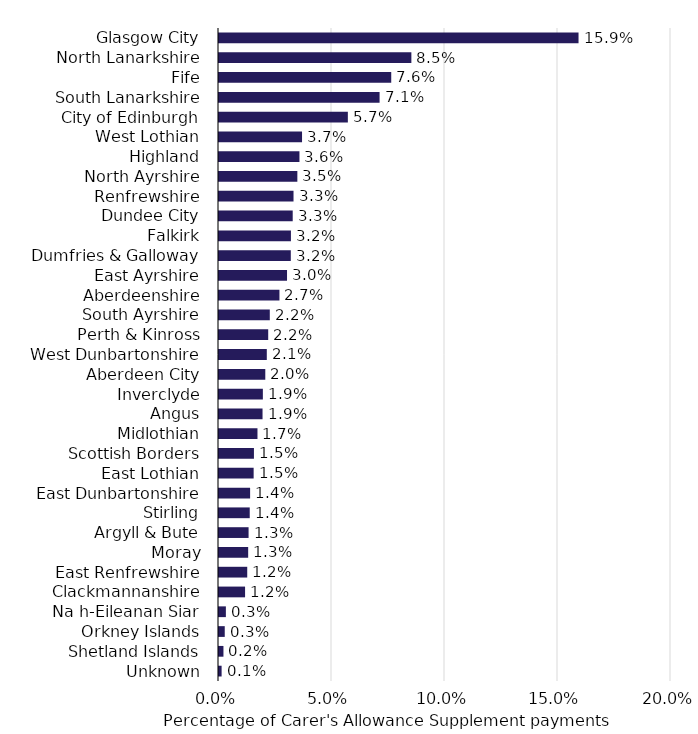
| Category | April Eligibiltiy |
|---|---|
| Glasgow City | 0.159 |
| North Lanarkshire | 0.085 |
| Fife | 0.076 |
| South Lanarkshire | 0.071 |
| City of Edinburgh | 0.057 |
| West Lothian | 0.037 |
| Highland | 0.036 |
| North Ayrshire | 0.035 |
| Renfrewshire | 0.033 |
| Dundee City | 0.033 |
| Falkirk | 0.032 |
| Dumfries & Galloway | 0.032 |
| East Ayrshire | 0.03 |
| Aberdeenshire | 0.027 |
| South Ayrshire | 0.022 |
| Perth & Kinross | 0.022 |
| West Dunbartonshire | 0.021 |
| Aberdeen City | 0.02 |
| Inverclyde | 0.019 |
| Angus | 0.019 |
| Midlothian | 0.017 |
| Scottish Borders | 0.015 |
| East Lothian | 0.015 |
| East Dunbartonshire | 0.014 |
| Stirling | 0.014 |
| Argyll & Bute | 0.013 |
| Moray | 0.013 |
| East Renfrewshire | 0.012 |
| Clackmannanshire | 0.012 |
| Na h-Eileanan Siar | 0.003 |
| Orkney Islands | 0.003 |
| Shetland Islands | 0.002 |
| Unknown | 0.001 |